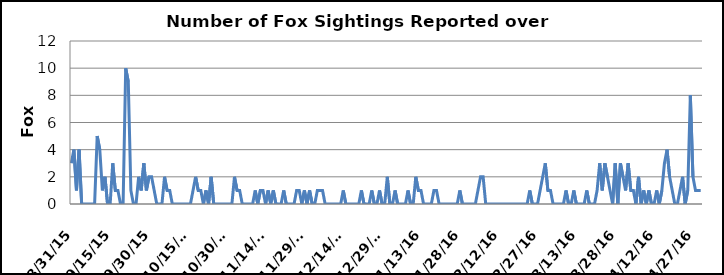
| Category | Fox Sightings |
|---|---|
| 8/31/15 | 3 |
| 9/1/15 | 4 |
| 9/2/15 | 1 |
| 9/3/15 | 4 |
| 9/4/15 | 0 |
| 9/5/15 | 0 |
| 9/6/15 | 0 |
| 9/7/15 | 0 |
| 9/8/15 | 0 |
| 9/9/15 | 0 |
| 9/10/15 | 5 |
| 9/11/15 | 4 |
| 9/12/15 | 1 |
| 9/13/15 | 2 |
| 9/14/15 | 0 |
| 9/15/15 | 0 |
| 9/16/15 | 3 |
| 9/17/15 | 1 |
| 9/18/15 | 1 |
| 9/19/15 | 0 |
| 9/20/15 | 0 |
| 9/21/15 | 10 |
| 9/22/15 | 9 |
| 9/23/15 | 1 |
| 9/24/15 | 0 |
| 9/25/15 | 0 |
| 9/26/15 | 2 |
| 9/27/15 | 1 |
| 9/28/15 | 3 |
| 9/29/15 | 1 |
| 9/30/15 | 2 |
| 10/1/15 | 2 |
| 10/2/15 | 1 |
| 10/3/15 | 0 |
| 10/4/15 | 0 |
| 10/5/15 | 0 |
| 10/6/15 | 2 |
| 10/7/15 | 1 |
| 10/8/15 | 1 |
| 10/9/15 | 0 |
| 10/10/15 | 0 |
| 10/11/15 | 0 |
| 10/12/15 | 0 |
| 10/13/15 | 0 |
| 10/14/15 | 0 |
| 10/15/15 | 0 |
| 10/16/15 | 0 |
| 10/17/15 | 1 |
| 10/18/15 | 2 |
| 10/19/15 | 1 |
| 10/20/15 | 1 |
| 10/21/15 | 0 |
| 10/22/15 | 1 |
| 10/23/15 | 0 |
| 10/24/15 | 2 |
| 10/25/15 | 0 |
| 10/26/15 | 0 |
| 10/27/15 | 0 |
| 10/28/15 | 0 |
| 10/29/15 | 0 |
| 10/30/15 | 0 |
| 10/31/15 | 0 |
| 11/1/15 | 0 |
| 11/2/15 | 2 |
| 11/3/15 | 1 |
| 11/4/15 | 1 |
| 11/5/15 | 0 |
| 11/6/15 | 0 |
| 11/7/15 | 0 |
| 11/8/15 | 0 |
| 11/9/15 | 0 |
| 11/10/15 | 1 |
| 11/11/15 | 0 |
| 11/12/15 | 1 |
| 11/13/15 | 1 |
| 11/14/15 | 0 |
| 11/15/15 | 1 |
| 11/16/15 | 0 |
| 11/17/15 | 1 |
| 11/18/15 | 0 |
| 11/19/15 | 0 |
| 11/20/15 | 0 |
| 11/21/15 | 1 |
| 11/22/15 | 0 |
| 11/23/15 | 0 |
| 11/24/15 | 0 |
| 11/25/15 | 0 |
| 11/26/15 | 1 |
| 11/27/15 | 1 |
| 11/28/15 | 0 |
| 11/29/15 | 1 |
| 11/30/15 | 0 |
| 12/1/15 | 1 |
| 12/2/15 | 0 |
| 12/3/15 | 0 |
| 12/4/15 | 1 |
| 12/5/15 | 1 |
| 12/6/15 | 1 |
| 12/7/15 | 0 |
| 12/8/15 | 0 |
| 12/9/15 | 0 |
| 12/10/15 | 0 |
| 12/11/15 | 0 |
| 12/13/15 | 0 |
| 12/14/15 | 1 |
| 12/15/15 | 0 |
| 12/16/15 | 0 |
| 12/17/15 | 0 |
| 12/18/15 | 0 |
| 12/19/15 | 0 |
| 12/20/15 | 0 |
| 12/21/15 | 1 |
| 12/22/15 | 0 |
| 12/23/15 | 0 |
| 12/24/15 | 0 |
| 12/25/15 | 1 |
| 12/26/15 | 0 |
| 12/27/15 | 0 |
| 12/28/15 | 1 |
| 12/29/15 | 0 |
| 12/30/15 | 0 |
| 12/31/15 | 2 |
| 1/1/16 | 0 |
| 1/2/16 | 0 |
| 1/3/16 | 1 |
| 1/4/16 | 0 |
| 1/5/16 | 0 |
| 1/6/16 | 0 |
| 1/7/16 | 0 |
| 1/8/16 | 1 |
| 1/9/16 | 0 |
| 1/10/16 | 0 |
| 1/11/16 | 2 |
| 1/12/16 | 1 |
| 1/13/16 | 1 |
| 1/14/16 | 0 |
| 1/15/16 | 0 |
| 1/16/16 | 0 |
| 1/17/16 | 0 |
| 1/18/16 | 1 |
| 1/19/16 | 1 |
| 1/20/16 | 0 |
| 1/21/16 | 0 |
| 1/22/16 | 0 |
| 1/23/16 | 0 |
| 1/24/16 | 0 |
| 1/25/16 | 0 |
| 1/26/16 | 0 |
| 1/27/16 | 0 |
| 1/28/16 | 1 |
| 1/29/16 | 0 |
| 1/30/16 | 0 |
| 1/31/16 | 0 |
| 2/1/16 | 0 |
| 2/2/16 | 0 |
| 2/3/16 | 0 |
| 2/4/16 | 1 |
| 2/5/16 | 2 |
| 2/6/16 | 2 |
| 2/7/16 | 0 |
| 2/8/16 | 0 |
| 2/9/16 | 0 |
| 2/10/16 | 0 |
| 2/11/16 | 0 |
| 2/12/16 | 0 |
| 2/13/16 | 0 |
| 2/14/16 | 0 |
| 2/15/16 | 0 |
| 2/16/16 | 0 |
| 2/17/16 | 0 |
| 2/18/16 | 0 |
| 2/19/16 | 0 |
| 2/20/16 | 0 |
| 2/21/16 | 0 |
| 2/22/16 | 0 |
| 2/23/16 | 0 |
| 2/24/16 | 1 |
| 2/25/16 | 0 |
| 2/26/16 | 0 |
| 2/27/16 | 0 |
| 2/28/16 | 1 |
| 2/29/16 | 2 |
| 3/1/16 | 3 |
| 3/2/16 | 1 |
| 3/3/16 | 1 |
| 3/4/16 | 0 |
| 3/5/16 | 0 |
| 3/6/16 | 0 |
| 3/7/16 | 0 |
| 3/8/16 | 0 |
| 3/9/16 | 1 |
| 3/10/16 | 0 |
| 3/11/16 | 0 |
| 3/12/16 | 1 |
| 3/13/16 | 0 |
| 3/14/16 | 0 |
| 3/15/16 | 0 |
| 3/16/16 | 0 |
| 3/17/16 | 1 |
| 3/18/16 | 0 |
| 3/19/16 | 0 |
| 3/20/16 | 0 |
| 3/21/16 | 1 |
| 3/22/16 | 3 |
| 3/23/16 | 1 |
| 3/24/16 | 3 |
| 3/25/16 | 2 |
| 3/26/16 | 1 |
| 3/27/16 | 0 |
| 3/28/16 | 3 |
| 3/29/16 | 0 |
| 3/30/16 | 3 |
| 3/31/16 | 2 |
| 4/1/16 | 1 |
| 4/2/16 | 3 |
| 4/3/16 | 1 |
| 4/4/16 | 1 |
| 4/5/16 | 0 |
| 4/6/16 | 2 |
| 4/7/16 | 0 |
| 4/8/16 | 1 |
| 4/9/16 | 0 |
| 4/10/16 | 1 |
| 4/11/16 | 0 |
| 4/12/16 | 0 |
| 4/13/16 | 1 |
| 4/14/16 | 0 |
| 4/15/16 | 1 |
| 4/16/16 | 3 |
| 4/17/16 | 4 |
| 4/18/16 | 2 |
| 4/19/16 | 1 |
| 4/20/16 | 0 |
| 4/21/16 | 0 |
| 4/22/16 | 1 |
| 4/23/16 | 2 |
| 4/24/16 | 0 |
| 4/25/16 | 1 |
| 4/26/16 | 8 |
| 4/27/16 | 2 |
| 4/28/16 | 1 |
| 4/29/16 | 1 |
| 4/30/16 | 1 |